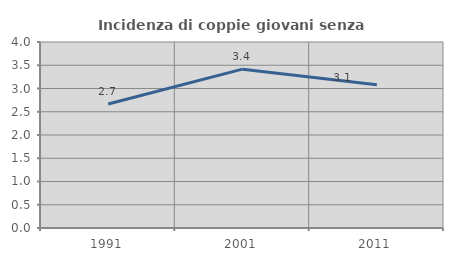
| Category | Incidenza di coppie giovani senza figli |
|---|---|
| 1991.0 | 2.665 |
| 2001.0 | 3.416 |
| 2011.0 | 3.082 |